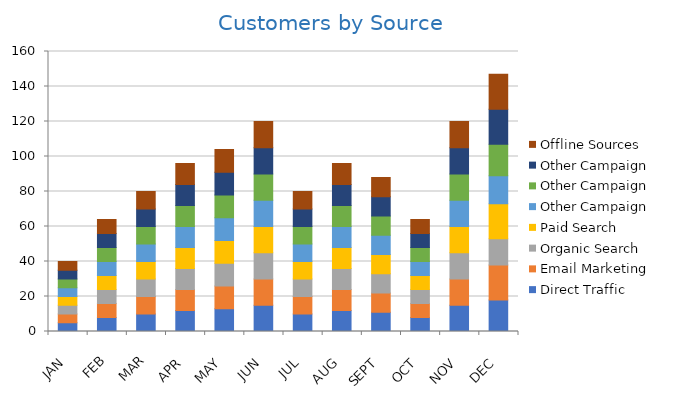
| Category | Direct Traffic | Email Marketing | Organic Search | Paid Search | Other Campaign  | Other Campaign | Offline Sources |
|---|---|---|---|---|---|---|---|
| JAN | 5 | 5 | 5 | 5 | 5 | 5 | 5 |
| FEB | 8 | 8 | 8 | 8 | 8 | 8 | 8 |
| MAR | 10 | 10 | 10 | 10 | 10 | 10 | 10 |
| APR | 12 | 12 | 12 | 12 | 12 | 12 | 12 |
| MAY | 13 | 13 | 13 | 13 | 13 | 13 | 13 |
| JUN | 15 | 15 | 15 | 15 | 15 | 15 | 15 |
| JUL | 10 | 10 | 10 | 10 | 10 | 10 | 10 |
| AUG | 12 | 12 | 12 | 12 | 12 | 12 | 12 |
| SEPT | 11 | 11 | 11 | 11 | 11 | 11 | 11 |
| OCT | 8 | 8 | 8 | 8 | 8 | 8 | 8 |
| NOV | 15 | 15 | 15 | 15 | 15 | 15 | 15 |
| DEC | 18 | 20 | 15 | 20 | 16 | 20 | 20 |